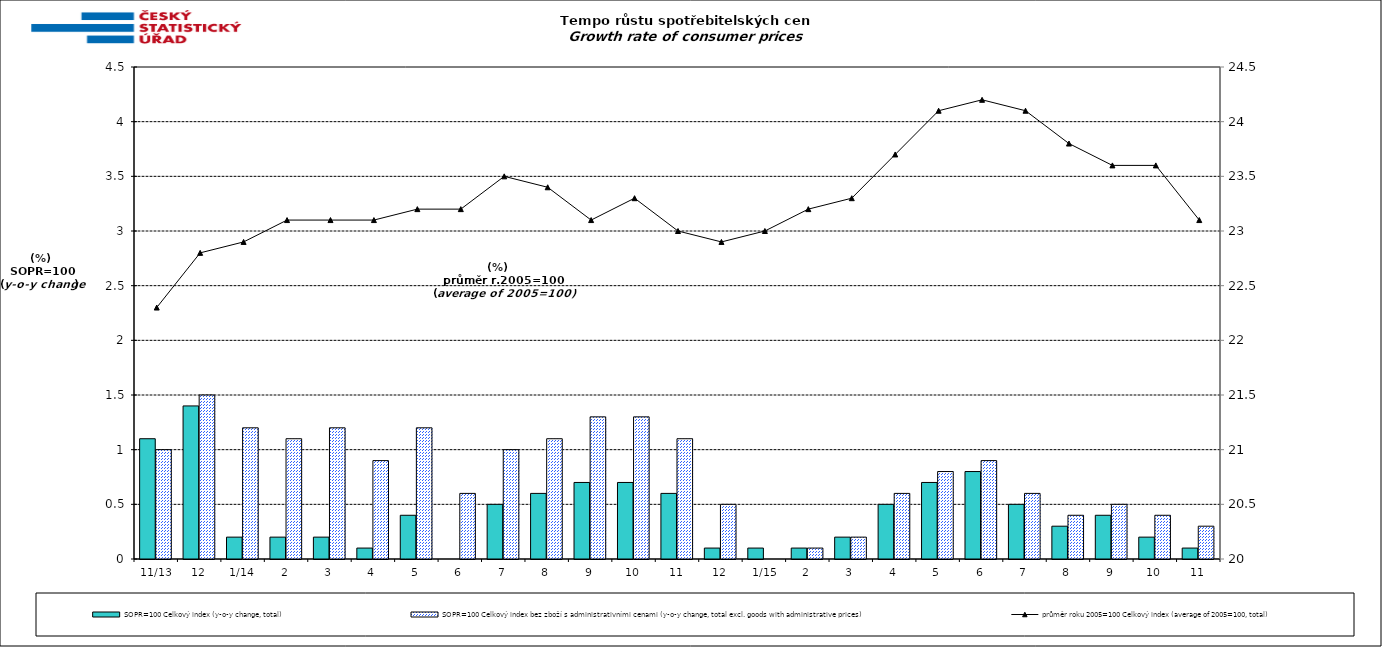
| Category | SOPR=100 Celkový index (y-o-y change, total) | SOPR=100 Celkový index bez zboží s administrativními cenami (y-o-y change, total excl. goods with administrative prices)  |
|---|---|---|
|  11/13 | 1.1 | 1 |
| 12 | 1.4 | 1.5 |
| 1/14 | 0.2 | 1.2 |
| 2 | 0.2 | 1.1 |
| 3 | 0.2 | 1.2 |
| 4 | 0.1 | 0.9 |
| 5 | 0.4 | 1.2 |
| 6 | 0 | 0.6 |
| 7 | 0.5 | 1 |
| 8 | 0.6 | 1.1 |
| 9 | 0.7 | 1.3 |
| 10 | 0.7 | 1.3 |
| 11 | 0.6 | 1.1 |
| 12 | 0.1 | 0.5 |
|  1/15 | 0.1 | 0 |
| 2 | 0.1 | 0.1 |
| 3 | 0.2 | 0.2 |
| 4 | 0.5 | 0.6 |
| 5 | 0.7 | 0.8 |
| 6 | 0.8 | 0.9 |
| 7 | 0.5 | 0.6 |
| 8 | 0.3 | 0.4 |
| 9 | 0.4 | 0.5 |
| 10 | 0.2 | 0.4 |
| 11 | 0.1 | 0.3 |